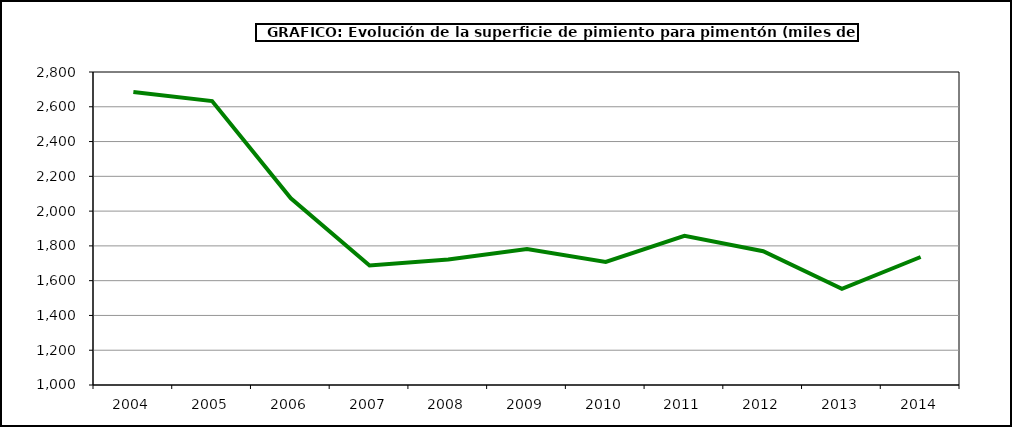
| Category | Superficie |
|---|---|
| 2004.0 | 2685 |
| 2005.0 | 2633 |
| 2006.0 | 2074 |
| 2007.0 | 1687 |
| 2008.0 | 1722 |
| 2009.0 | 1782 |
| 2010.0 | 1708 |
| 2011.0 | 1858 |
| 2012.0 | 1769 |
| 2013.0 | 1553 |
| 2014.0 | 1736 |